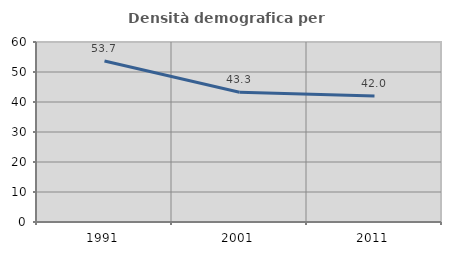
| Category | Densità demografica |
|---|---|
| 1991.0 | 53.677 |
| 2001.0 | 43.26 |
| 2011.0 | 41.988 |